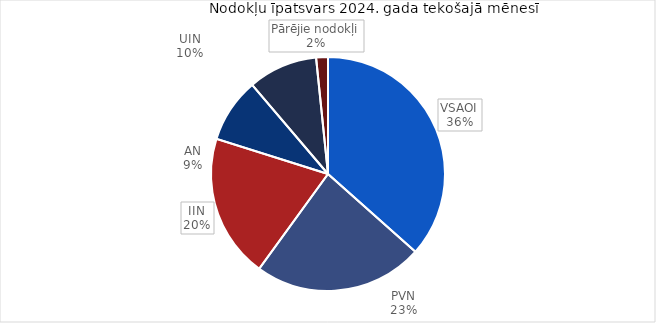
| Category | īpatsvars 2024 |
|---|---|
| VSAOI | 0.366 |
| PVN | 0.234 |
| IIN | 0.199 |
| AN | 0.089 |
| UIN | 0.096 |
| Pārējie nodokļi | 0.016 |